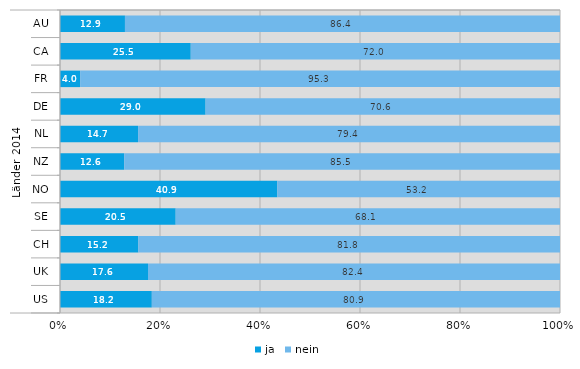
| Category | ja | nein |
|---|---|---|
| 0 | 12.9 | 86.4 |
| 1 | 25.5 | 72 |
| 2 | 4 | 95.3 |
| 3 | 29 | 70.6 |
| 4 | 14.7 | 79.4 |
| 5 | 12.6 | 85.5 |
| 6 | 40.9 | 53.2 |
| 7 | 20.5 | 68.1 |
| 8 | 15.2 | 81.8 |
| 9 | 17.6 | 82.4 |
| 10 | 18.2 | 80.9 |